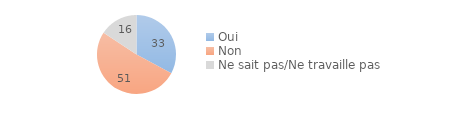
| Category | Series 0 |
|---|---|
| Oui | 32.83 |
| Non | 51.464 |
| Ne sait pas/Ne travaille pas | 15.672 |